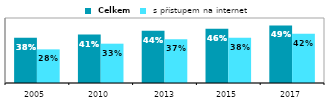
| Category |  Celkem |  s přístupem na internet |
|---|---|---|
| 2005 | 0.383 | 0.285 |
| 2010 | 0.41 | 0.333 |
|  2013 | 0.443 | 0.369 |
| 2015 | 0.459 | 0.383 |
| 2017 | 0.487 | 0.416 |